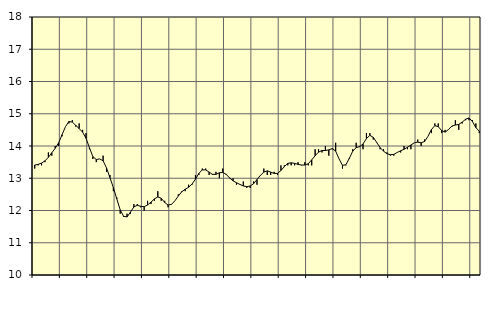
| Category | Piggar | Handel, SNI 45-47 |
|---|---|---|
| nan | 13.3 | 13.41 |
| 87.0 | 13.4 | 13.43 |
| 87.0 | 13.4 | 13.47 |
| 87.0 | 13.5 | 13.54 |
| nan | 13.8 | 13.65 |
| 88.0 | 13.7 | 13.79 |
| 88.0 | 14 | 13.93 |
| 88.0 | 14 | 14.1 |
| nan | 14.3 | 14.35 |
| 89.0 | 14.6 | 14.6 |
| 89.0 | 14.7 | 14.76 |
| 89.0 | 14.8 | 14.74 |
| nan | 14.6 | 14.64 |
| 90.0 | 14.7 | 14.54 |
| 90.0 | 14.5 | 14.43 |
| 90.0 | 14.4 | 14.24 |
| nan | 13.9 | 13.95 |
| 91.0 | 13.6 | 13.67 |
| 91.0 | 13.5 | 13.58 |
| 91.0 | 13.6 | 13.6 |
| nan | 13.7 | 13.54 |
| 92.0 | 13.2 | 13.32 |
| 92.0 | 13.1 | 13.02 |
| 92.0 | 12.6 | 12.71 |
| nan | 12.4 | 12.36 |
| 93.0 | 11.9 | 12.02 |
| 93.0 | 11.8 | 11.82 |
| 93.0 | 11.9 | 11.8 |
| nan | 11.9 | 11.95 |
| 94.0 | 12.2 | 12.11 |
| 94.0 | 12.2 | 12.16 |
| 94.0 | 12.1 | 12.13 |
| nan | 12 | 12.12 |
| 95.0 | 12.3 | 12.17 |
| 95.0 | 12.2 | 12.26 |
| 95.0 | 12.3 | 12.36 |
| nan | 12.6 | 12.42 |
| 96.0 | 12.3 | 12.38 |
| 96.0 | 12.3 | 12.25 |
| 96.0 | 12.1 | 12.17 |
| nan | 12.2 | 12.19 |
| 97.0 | 12.3 | 12.3 |
| 97.0 | 12.5 | 12.45 |
| 97.0 | 12.6 | 12.58 |
| nan | 12.6 | 12.66 |
| 98.0 | 12.8 | 12.72 |
| 98.0 | 12.8 | 12.82 |
| 98.0 | 13.1 | 12.97 |
| nan | 13.1 | 13.15 |
| 99.0 | 13.3 | 13.26 |
| 99.0 | 13.3 | 13.26 |
| 99.0 | 13.1 | 13.19 |
| nan | 13.1 | 13.12 |
| 0.0 | 13.2 | 13.12 |
| 0.0 | 13 | 13.17 |
| 0.0 | 13.3 | 13.18 |
| nan | 13.1 | 13.12 |
| 1.0 | 13 | 13.01 |
| 1.0 | 13 | 12.92 |
| 1.0 | 12.8 | 12.86 |
| nan | 12.8 | 12.81 |
| 2.0 | 12.9 | 12.76 |
| 2.0 | 12.7 | 12.74 |
| 2.0 | 12.7 | 12.76 |
| nan | 12.9 | 12.83 |
| 3.0 | 12.8 | 12.96 |
| 3.0 | 13.1 | 13.09 |
| 3.0 | 13.3 | 13.19 |
| nan | 13.1 | 13.23 |
| 4.0 | 13.1 | 13.19 |
| 4.0 | 13.2 | 13.15 |
| 4.0 | 13.1 | 13.15 |
| nan | 13.4 | 13.24 |
| 5.0 | 13.4 | 13.36 |
| 5.0 | 13.4 | 13.46 |
| 5.0 | 13.4 | 13.48 |
| nan | 13.4 | 13.46 |
| 6.0 | 13.5 | 13.43 |
| 6.0 | 13.4 | 13.41 |
| 6.0 | 13.5 | 13.41 |
| nan | 13.4 | 13.45 |
| 7.0 | 13.4 | 13.57 |
| 7.0 | 13.9 | 13.7 |
| 7.0 | 13.9 | 13.81 |
| nan | 13.8 | 13.86 |
| 8.0 | 14 | 13.86 |
| 8.0 | 13.7 | 13.88 |
| 8.0 | 13.9 | 13.92 |
| nan | 14.1 | 13.84 |
| 9.0 | 13.6 | 13.6 |
| 9.0 | 13.3 | 13.4 |
| 9.0 | 13.4 | 13.42 |
| nan | 13.6 | 13.62 |
| 10.0 | 13.9 | 13.84 |
| 10.0 | 14.1 | 13.95 |
| 10.0 | 14 | 13.98 |
| nan | 13.9 | 14.06 |
| 11.0 | 14.4 | 14.23 |
| 11.0 | 14.4 | 14.33 |
| 11.0 | 14.2 | 14.27 |
| nan | 14.1 | 14.11 |
| 12.0 | 13.9 | 13.95 |
| 12.0 | 13.9 | 13.84 |
| 12.0 | 13.8 | 13.76 |
| nan | 13.7 | 13.73 |
| 13.0 | 13.7 | 13.74 |
| 13.0 | 13.8 | 13.8 |
| 13.0 | 13.8 | 13.85 |
| nan | 14 | 13.9 |
| 14.0 | 13.9 | 13.96 |
| 14.0 | 13.9 | 14.03 |
| 14.0 | 14.1 | 14.1 |
| nan | 14.2 | 14.12 |
| 15.0 | 14 | 14.1 |
| 15.0 | 14.2 | 14.14 |
| 15.0 | 14.3 | 14.3 |
| nan | 14.4 | 14.51 |
| 16.0 | 14.7 | 14.63 |
| 16.0 | 14.7 | 14.6 |
| 16.0 | 14.4 | 14.48 |
| nan | 14.5 | 14.43 |
| 17.0 | 14.5 | 14.51 |
| 17.0 | 14.6 | 14.62 |
| 17.0 | 14.8 | 14.65 |
| nan | 14.5 | 14.67 |
| 18.0 | 14.7 | 14.74 |
| 18.0 | 14.8 | 14.83 |
| 18.0 | 14.8 | 14.87 |
| nan | 14.8 | 14.76 |
| 19.0 | 14.7 | 14.57 |
| 19.0 | 14.4 | 14.46 |